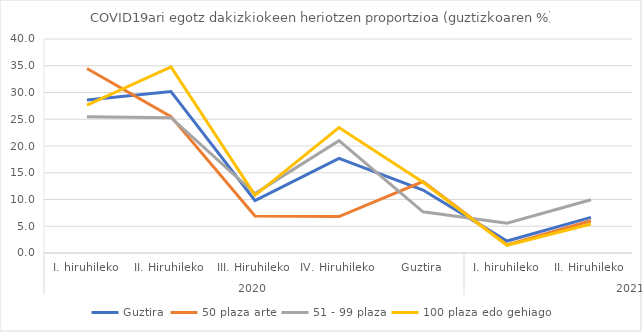
| Category | Guztira | 50 plaza arte | 51 - 99 plaza | 100 plaza edo gehiago |
|---|---|---|---|---|
| 0 | 28.62 | 34.483 | 25.49 | 27.66 |
| 1 | 30.168 | 25.485 | 25.287 | 34.773 |
| 2 | 9.789 | 6.92 | 11.111 | 10.784 |
| 3 | 17.673 | 6.818 | 20.992 | 23.438 |
| 4 | 11.769 | 13.356 | 7.692 | 13.208 |
| 5 | 2.239 | 1.523 | 5.556 | 1.441 |
| 6 | 6.65 | 6.019 | 9.948 | 5.432 |